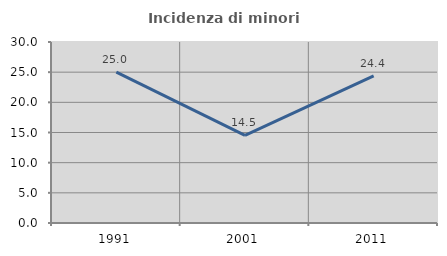
| Category | Incidenza di minori stranieri |
|---|---|
| 1991.0 | 25 |
| 2001.0 | 14.516 |
| 2011.0 | 24.373 |